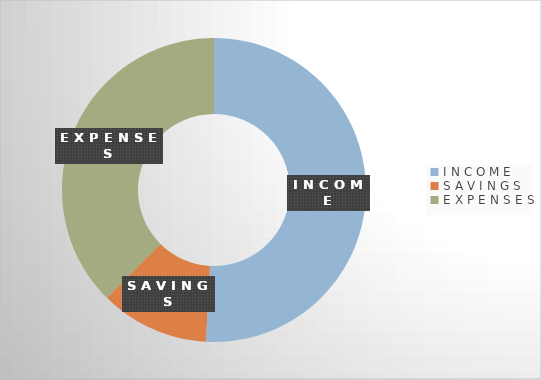
| Category | Series 0 |
|---|---|
| I N C O M E | 7257 |
| S A V I N G S | 1655 |
| E X P E N S E S | 5359 |